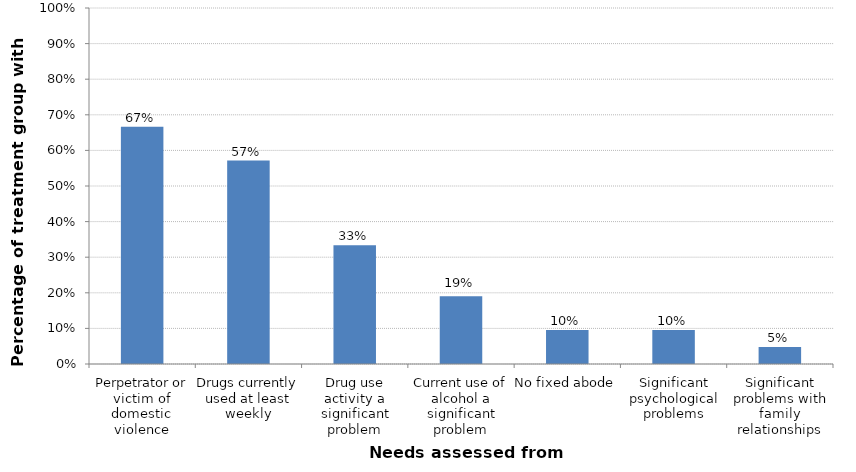
| Category | Percentage of treatment group with need |
|---|---|
| Perpetrator or victim of domestic violence | 0.667 |
| Drugs currently used at least weekly | 0.571 |
| Drug use activity a significant problem | 0.333 |
| Current use of alcohol a significant problem | 0.19 |
| No fixed abode | 0.095 |
| Significant psychological problems | 0.095 |
| Significant problems with family relationships | 0.048 |